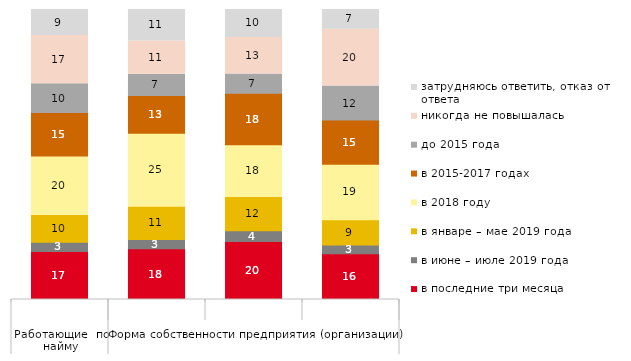
| Category | в последние три месяца | в июне – июле 2019 года | в январе – мае 2019 года | в 2018 году | в 2015-2017 годах | до 2015 года | никогда не повышалась | затрудняюсь ответить, отказ от ответа |
|---|---|---|---|---|---|---|---|---|
| 0 | 16.523 | 3.247 | 9.551 | 20.153 | 14.995 | 9.933 | 16.619 | 8.978 |
| 1 | 17.516 | 3.185 | 11.465 | 25.159 | 13.057 | 7.325 | 11.465 | 10.828 |
| 2 | 20 | 3.704 | 11.852 | 17.778 | 17.778 | 6.667 | 12.593 | 9.63 |
| 3 | 15.75 | 3.036 | 8.729 | 19.165 | 15.18 | 11.765 | 19.545 | 6.831 |